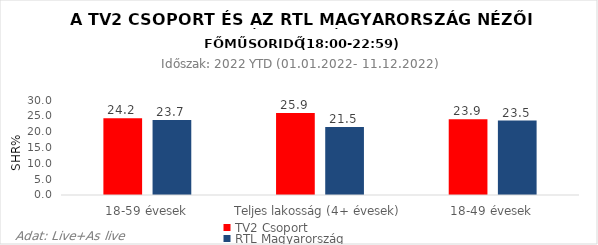
| Category | TV2 Csoport | RTL Magyarország |
|---|---|---|
| 18-59 évesek | 24.2 | 23.7 |
| Teljes lakosság (4+ évesek) | 25.9 | 21.5 |
| 18-49 évesek | 23.9 | 23.5 |